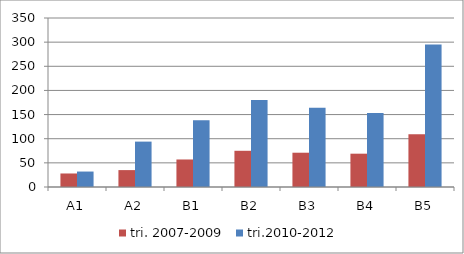
| Category | tri. 2007-2009 | tri.2010-2012 |
|---|---|---|
| A1 | 28 | 32 |
| A2 | 35 | 94 |
| B1 | 57 | 138 |
| B2 | 75 | 180 |
| B3 | 71 | 164 |
| B4 | 69 | 153 |
| B5 | 109 | 295 |